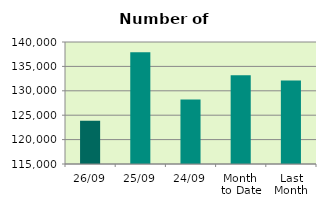
| Category | Series 0 |
|---|---|
| 26/09 | 123860 |
| 25/09 | 137878 |
| 24/09 | 128220 |
| Month 
to Date | 133211.474 |
| Last
Month | 132110.818 |